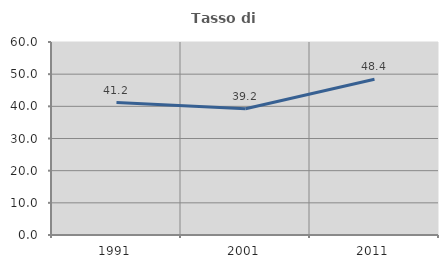
| Category | Tasso di occupazione   |
|---|---|
| 1991.0 | 41.161 |
| 2001.0 | 39.233 |
| 2011.0 | 48.438 |